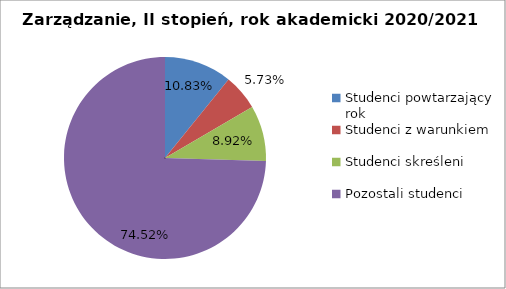
| Category | Series 0 |
|---|---|
| Studenci powtarzający rok | 34 |
| Studenci z warunkiem | 18 |
| Studenci skreśleni | 28 |
| Pozostali studenci | 234 |